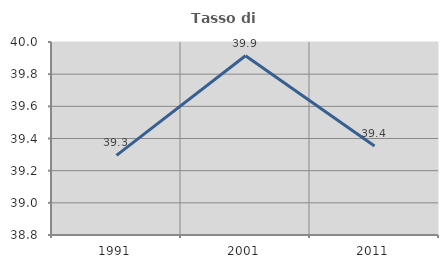
| Category | Tasso di occupazione   |
|---|---|
| 1991.0 | 39.295 |
| 2001.0 | 39.915 |
| 2011.0 | 39.353 |